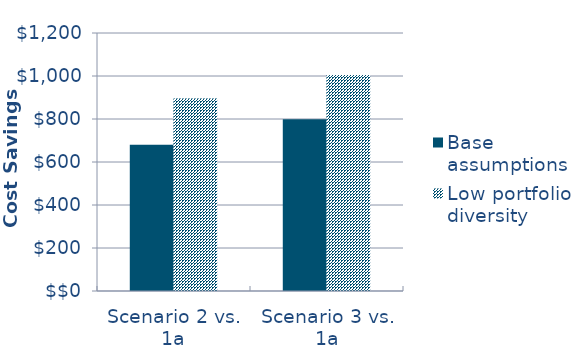
| Category | Base assumptions  | Low portfolio diversity |
|---|---|---|
| Scenario 2 vs. 1a | -679.806 | -895.146 |
| Scenario 3 vs. 1a | -799.049 | -1004.243 |